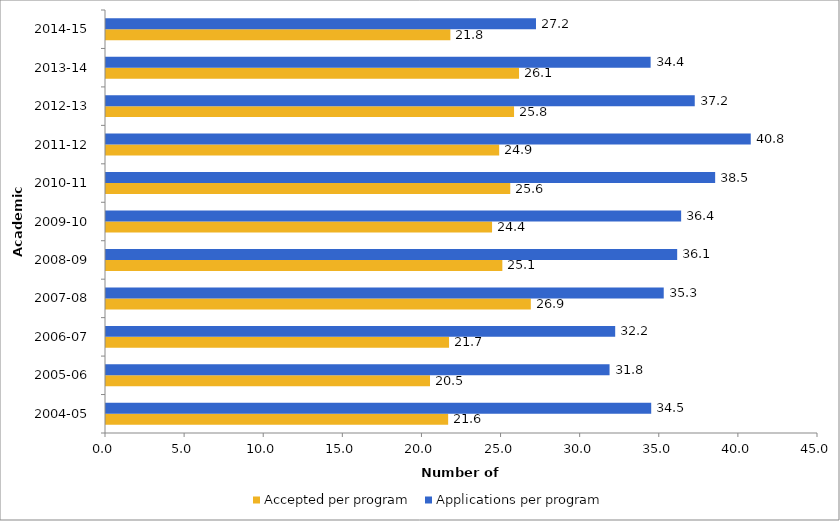
| Category | Accepted per program | Applications per program |
|---|---|---|
| 2004-05 | 21.625 | 34.458 |
| 2005-06 | 20.478 | 31.826 |
| 2006-07 | 21.682 | 32.182 |
| 2007-08 | 26.85 | 35.25 |
| 2008-09 | 25.05 | 36.1 |
| 2009-10 | 24.4 | 36.35 |
| 2010-11 | 25.55 | 38.5 |
| 2011-12 | 24.85 | 40.75 |
| 2012-13 | 25.789 | 37.211 |
| 2013-14 | 26.105 | 34.421 |
| 2014-15 | 21.765 | 27.176 |